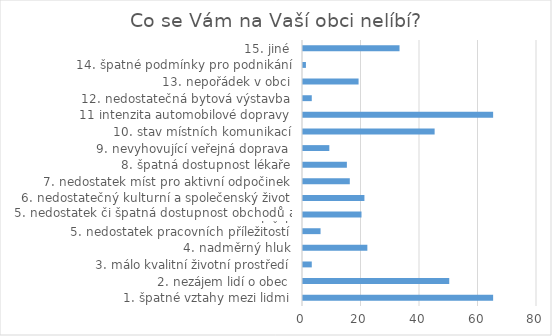
| Category | Series 0 |
|---|---|
| 1. špatné vztahy mezi lidmi | 65 |
| 2. nezájem lidí o obec | 50 |
| 3. málo kvalitní životní prostředí | 3 |
| 4. nadměrný hluk | 22 |
| 5. nedostatek pracovních příležitostí | 6 |
| 5. nedostatek či špatná dostupnost obchodů a služeb | 20 |
| 6. nedostatečný kulturní a společenský život | 21 |
| 7. nedostatek míst pro aktivní odpočinek | 16 |
| 8. špatná dostupnost lékaře | 15 |
| 9. nevyhovující veřejná doprava | 9 |
| 10. stav místních komunikací | 45 |
| 11 intenzita automobilové dopravy | 65 |
| 12. nedostatečná bytová výstavba | 3 |
| 13. nepořádek v obci | 19 |
| 14. špatné podmínky pro podnikání | 1 |
| 15. jiné | 33 |